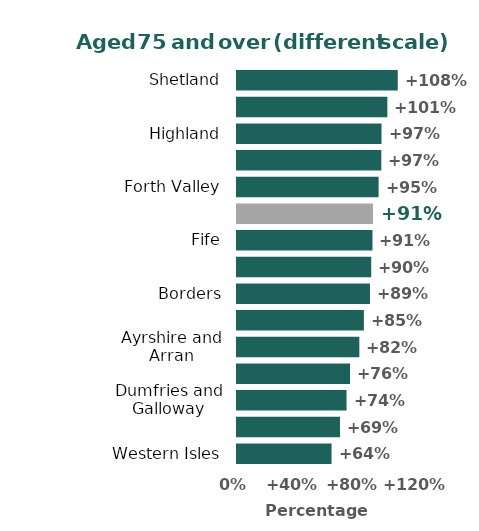
| Category | Series 0 |
|---|---|
| Western Isles | 63.643 |
| Greater Glasgow and Clyde | 69.317 |
| Dumfries and Galloway | 73.74 |
| Tayside | 76.099 |
| Ayrshire and Arran | 82.343 |
| Scotland | 85.407 |
| Borders | 89.497 |
| Grampian | 90.343 |
| Fife | 91.188 |
| Lanarkshire | 91.495 |
| Forth Valley | 95.308 |
| Lothian | 97.132 |
| Highland | 97.272 |
| Orkney | 101.214 |
| Shetland | 108.197 |